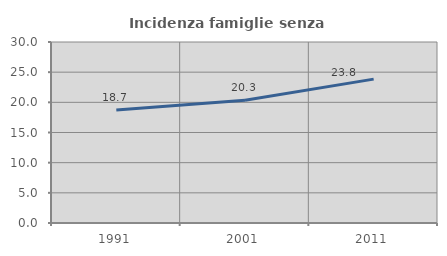
| Category | Incidenza famiglie senza nuclei |
|---|---|
| 1991.0 | 18.749 |
| 2001.0 | 20.336 |
| 2011.0 | 23.848 |